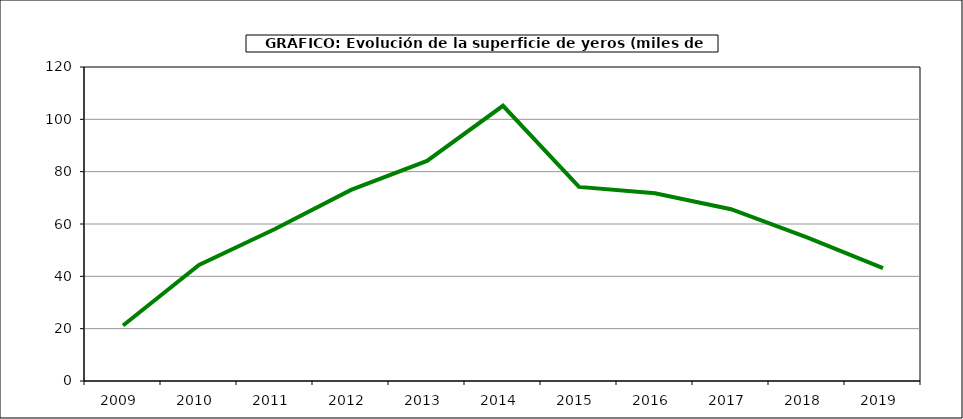
| Category | Superficie |
|---|---|
| 2009.0 | 21.198 |
| 2010.0 | 44.369 |
| 2011.0 | 58.104 |
| 2012.0 | 73.051 |
| 2013.0 | 84.103 |
| 2014.0 | 105.185 |
| 2015.0 | 74.162 |
| 2016.0 | 71.777 |
| 2017.0 | 65.659 |
| 2018.0 | 54.885 |
| 2019.0 | 43.102 |